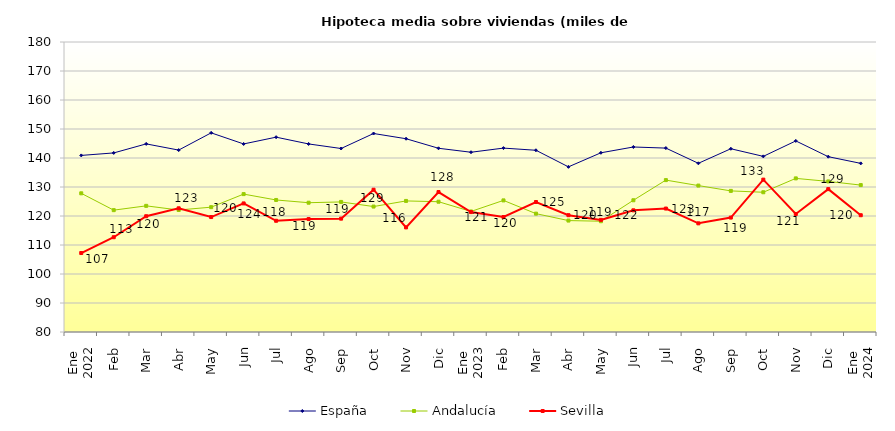
| Category |  España  |  Andalucía  |  Sevilla  |
|---|---|---|---|
| 0 | 140.892 | 127.823 | 107.232 |
| 1 | 141.749 | 122.018 | 112.68 |
| 2 | 144.862 | 123.5 | 119.92 |
| 3 | 142.728 | 122.067 | 122.651 |
| 4 | 148.674 | 123.045 | 119.635 |
| 5 | 144.846 | 127.554 | 124.34 |
| 6 | 147.183 | 125.528 | 118.354 |
| 7 | 144.844 | 124.581 | 118.95 |
| 8 | 143.275 | 124.854 | 119.085 |
| 9 | 148.443 | 123.256 | 129.062 |
| 10 | 146.645 | 125.195 | 116.07 |
| 11 | 143.351 | 124.927 | 128.255 |
| 12 | 141.984 | 121.572 | 121.343 |
| 13 | 143.413 | 125.381 | 119.65 |
| 14 | 142.663 | 120.811 | 124.823 |
| 15 | 136.945 | 118.425 | 120.28 |
| 16 | 141.798 | 118.2 | 118.665 |
| 17 | 143.796 | 125.428 | 121.958 |
| 18 | 143.412 | 132.38 | 122.57 |
| 19 | 138.171 | 130.487 | 117.471 |
| 20 | 143.186 | 128.657 | 119.454 |
| 21 | 140.564 | 128.189 | 132.54 |
| 22 | 145.894 | 132.969 | 120.704 |
| 23 | 140.451 | 131.925 | 129.268 |
| 24 | 138.149 | 130.662 | 120.268 |